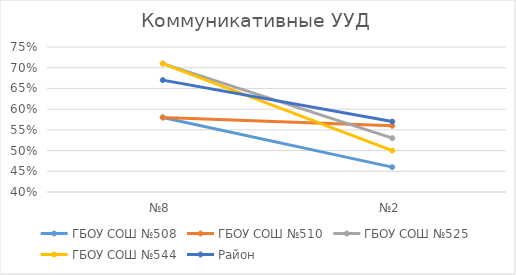
| Category | ГБОУ СОШ №508 | ГБОУ СОШ №510 | ГБОУ СОШ №525 | ГБОУ СОШ №544 | Район |
|---|---|---|---|---|---|
| №8 | 0.58 | 0.58 | 0.71 | 0.71 | 0.67 |
| №2 | 0.46 | 0.56 | 0.53 | 0.5 | 0.57 |